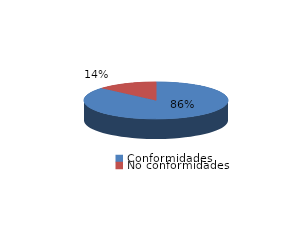
| Category | Series 0 |
|---|---|
| Conformidades | 1169 |
| No conformidades | 183 |